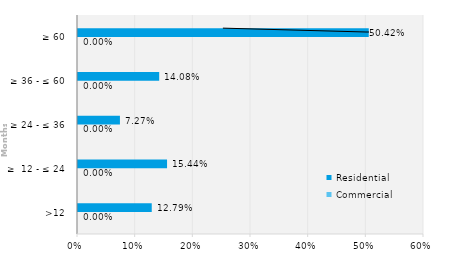
| Category | Commercial | Residential |
|---|---|---|
| >12 | 0 | 0.128 |
| ≥  12 - ≤ 24 | 0 | 0.154 |
| ≥ 24 - ≤ 36 | 0 | 0.073 |
| ≥ 36 - ≤ 60 | 0 | 0.141 |
| ≥ 60 | 0 | 0.504 |